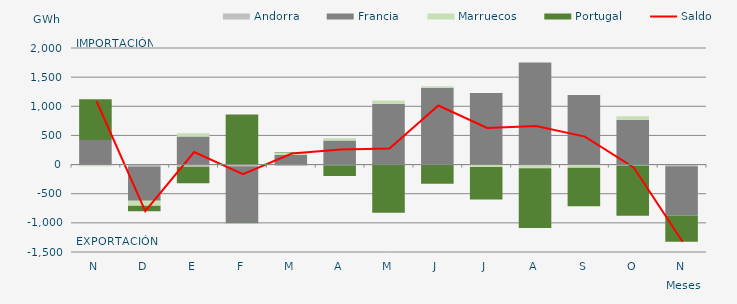
| Category | Andorra | Francia | Marruecos | Portugal |
|---|---|---|---|---|
| N | -14.884 | 423.038 | -15.41 | 698.188 |
| D | -35.076 | -586.843 | -82.554 | -95.842 |
| E | -38.419 | 481.868 | 55.475 | -284.018 |
| F | -28.394 | -984.629 | -8.698 | 859.135 |
| M | -22.893 | 167.561 | 36.658 | 8.529 |
| A | -12.109 | 414.006 | 37.615 | -182.942 |
| M | 0 | 1041.33 | 58.27 | -825.3 |
| J | -5.126 | 1319.492 | 23.039 | -324.448 |
| J | -3.551 | 1227.622 | -38.635 | -558.283 |
| A | -19.02 | 1749.787 | -45.265 | -1024.065 |
| S | -11.131 | 1193.426 | -45.19 | -657.205 |
| O | -15.195 | 769.063 | 59.008 | -860.78 |
| N | -30.163 | -841.736 | -1.399 | -450.652 |